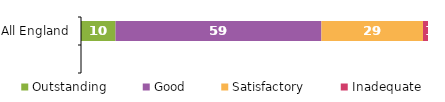
| Category | Outstanding | Good | Satisfactory | Inadequate |
|---|---|---|---|---|
| All England | 9.954 | 59.331 | 29.27 | 1.445 |